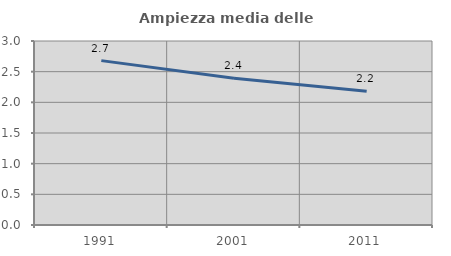
| Category | Ampiezza media delle famiglie |
|---|---|
| 1991.0 | 2.68 |
| 2001.0 | 2.393 |
| 2011.0 | 2.179 |